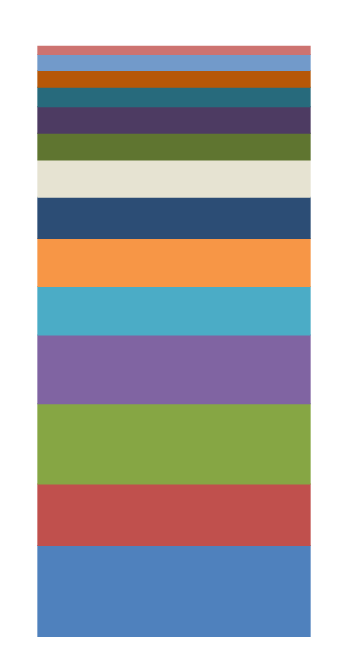
| Category | Doprava - DPMB | Doprava - ostatní | Státní správa a územ. samospráva | Bydlení, kom. služ. a územ. rozvoj | Vzdělávání | Kultura, církve a sděl. prostředky | Ochrana životního prostředí | Vodní hospodářství | Tělovýchova a zájmová činnost | Sociální péče a pomoc | Bezpečnost a veřejný pořádek | Finanční operace | Zdravotnictví | Jiné veřejné služby a činnosti |
|---|---|---|---|---|---|---|---|---|---|---|---|---|---|---|
| 0 | 4632.442 | 3100.199 | 4031.334 | 3456.48 | 2452.626 | 2404.67 | 2076.311 | 1875.407 | 1346.085 | 1334.348 | 986.716 | 845.685 | 799.014 | 424.195 |